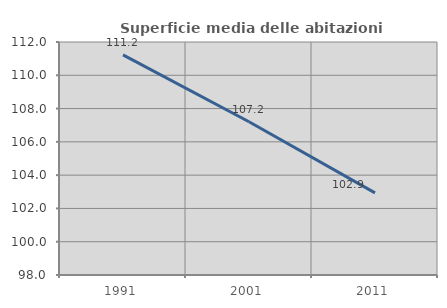
| Category | Superficie media delle abitazioni occupate |
|---|---|
| 1991.0 | 111.225 |
| 2001.0 | 107.207 |
| 2011.0 | 102.933 |